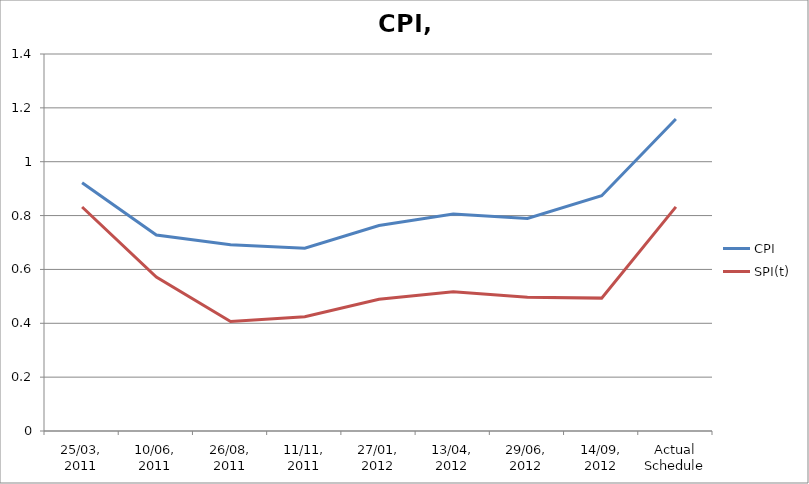
| Category | CPI | SPI(t) |
|---|---|---|
| 25/03, 2011 | 0.922 | 0.832 |
| 10/06, 2011 | 0.728 | 0.572 |
| 26/08, 2011 | 0.691 | 0.407 |
| 11/11, 2011 | 0.678 | 0.424 |
| 27/01, 2012 | 0.763 | 0.49 |
| 13/04, 2012 | 0.805 | 0.517 |
| 29/06, 2012 | 0.789 | 0.497 |
| 14/09, 2012 | 0.874 | 0.493 |
| Actual Schedule | 1.158 | 0.832 |